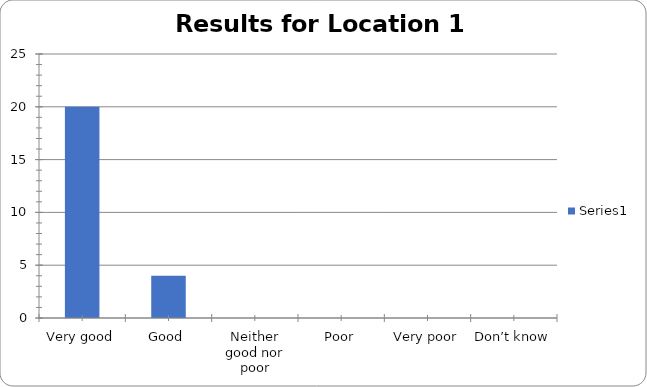
| Category | Series 0 |
|---|---|
| Very good | 20 |
| Good | 4 |
| Neither good nor poor | 0 |
| Poor | 0 |
| Very poor | 0 |
| Don’t know | 0 |